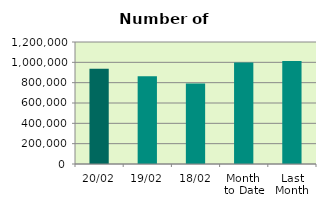
| Category | Series 0 |
|---|---|
| 20/02 | 938040 |
| 19/02 | 863558 |
| 18/02 | 791964 |
| Month 
to Date | 997445.286 |
| Last
Month | 1012702.182 |